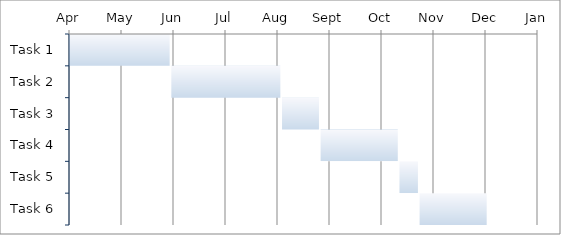
| Category | Start Date | Duration |
|---|---|---|
| Task 1 | 2014-04-01 | 60 |
| Task 2 | 2014-06-01 | 65 |
| Task 3 | 2014-08-06 | 22 |
| Task 4 | 2014-08-29 | 46 |
| Task 5 | 2014-10-15 | 11 |
| Task 6 | 2014-10-27 | 40 |